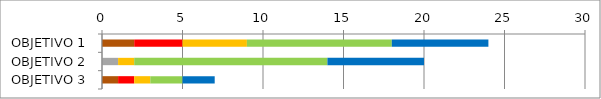
| Category | Series 0 | Series 1 | Series 2 | Series 3 | Series 4 | Series 5 |
|---|---|---|---|---|---|---|
| OBJETIVO 1 | 2 | 0 | 3 | 4 | 9 | 6 |
| OBJETIVO 2 | 0 | 1 | 0 | 1 | 12 | 6 |
| OBJETIVO 3 | 1 | 0 | 1 | 1 | 2 | 2 |